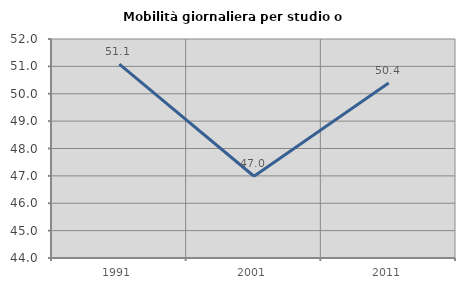
| Category | Mobilità giornaliera per studio o lavoro |
|---|---|
| 1991.0 | 51.079 |
| 2001.0 | 46.986 |
| 2011.0 | 50.392 |